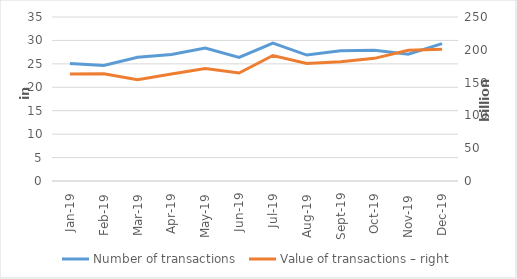
| Category | Number of transactions  |
|---|---|
| sij.19 | 25073175 |
| Feb-19 | 24650098 |
| ožu.19 | 26391868 |
| tra.19 | 27012008 |
| svi.19 | 28382711 |
| lip.19 | 26372563 |
| srp.19 | 29407797 |
| kol.19 | 26879474 |
| ruj.19 | 27814364 |
| lis.19 | 27907594 |
| stu.19 | 27051008 |
| pro.19 | 29312558 |